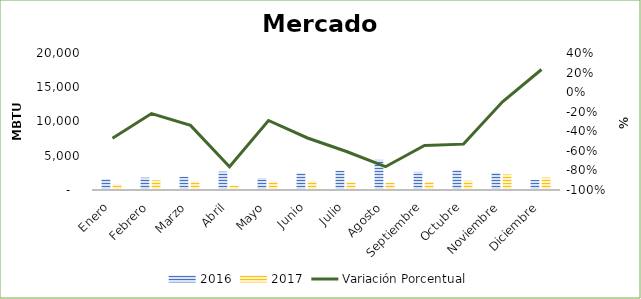
| Category | 2016 | 2017 |
|---|---|---|
| Enero | 1596.658 | 844.614 |
| Febrero | 1801.868 | 1406.788 |
| Marzo | 1948.274 | 1286.81 |
| Abril | 2682.04 | 637.938 |
| Mayo | 1755.953 | 1247.618 |
| Junio | 2438.159 | 1295.79 |
| Julio | 2803.919 | 1102.97 |
| Agosto | 4403.594 | 1048.043 |
| Septiembre | 2641.86 | 1202.754 |
| Octubre | 2882.988 | 1351.142 |
| Noviembre | 2516.522 | 2267.044 |
| Diciembre | 1472.35 | 1812.597 |